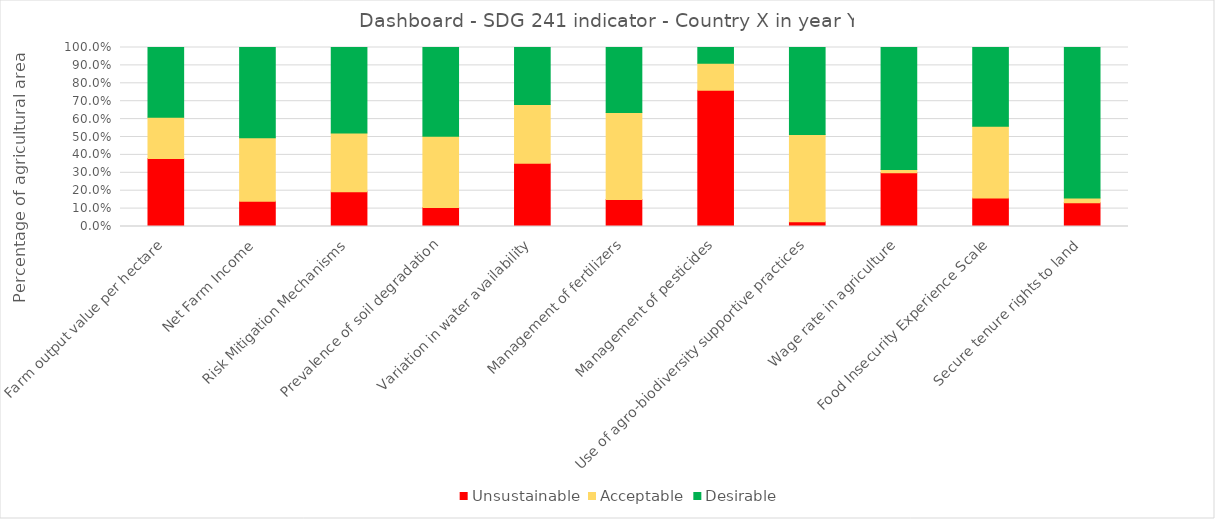
| Category | Unsustainable | Acceptable | Desirable |
|---|---|---|---|
| Farm output value per hectare | 0.381 | 0.23 | 0.389 |
| Net Farm Income | 0.142 | 0.354 | 0.504 |
| Risk Mitigation Mechanisms | 0.195 | 0.327 | 0.478 |
| Prevalence of soil degradation | 0.106 | 0.398 | 0.496 |
| Variation in water availability | 0.354 | 0.327 | 0.319 |
| Management of fertilizers | 0.15 | 0.487 | 0.363 |
| Management of pesticides | 0.761 | 0.15 | 0.088 |
| Use of agro-biodiversity supportive practices | 0.027 | 0.487 | 0.487 |
| Wage rate in agriculture | 0.301 | 0.018 | 0.681 |
| Food Insecurity Experience Scale | 0.16 | 0.4 | 0.44 |
| Secure tenure rights to land | 0.133 | 0.027 | 0.841 |